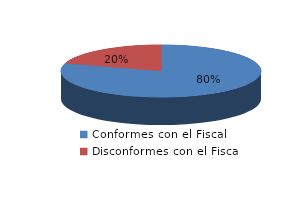
| Category | Series 0 |
|---|---|
| 0 | 654 |
| 1 | 167 |